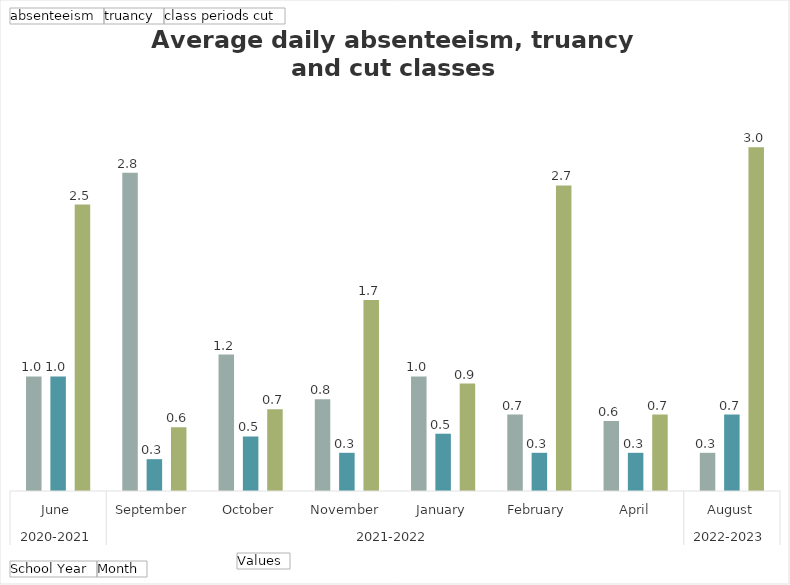
| Category | absenteeism | truancy | class periods cut |
|---|---|---|---|
| 0 | 1 | 1 | 2.5 |
| 1 | 2.778 | 0.278 | 0.556 |
| 2 | 1.19 | 0.476 | 0.714 |
| 3 | 0.8 | 0.333 | 1.667 |
| 4 | 1 | 0.5 | 0.938 |
| 5 | 0.667 | 0.333 | 2.667 |
| 6 | 0.611 | 0.333 | 0.667 |
| 7 | 0.333 | 0.667 | 3 |